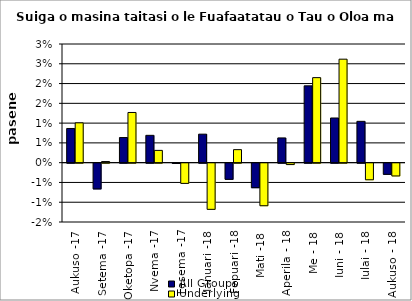
| Category | All Groups | Underlying |
|---|---|---|
| Aukuso -17 | 0.009 | 0.01 |
| Setema -17 | -0.007 | 0 |
| Oketopa -17 | 0.006 | 0.013 |
| Nvema -17 | 0.007 | 0.003 |
| Tesema -17 | 0 | -0.005 |
| Ianuari -18 | 0.007 | -0.012 |
| Fepuari -18 | -0.004 | 0.003 |
| Mati -18 | -0.006 | -0.011 |
| Aperila - 18 | 0.006 | 0 |
| Me - 18 | 0.019 | 0.021 |
| Iuni - 18 | 0.011 | 0.026 |
| Iulai - 18 | 0.01 | -0.004 |
| Aukuso - 18 | -0.003 | -0.003 |